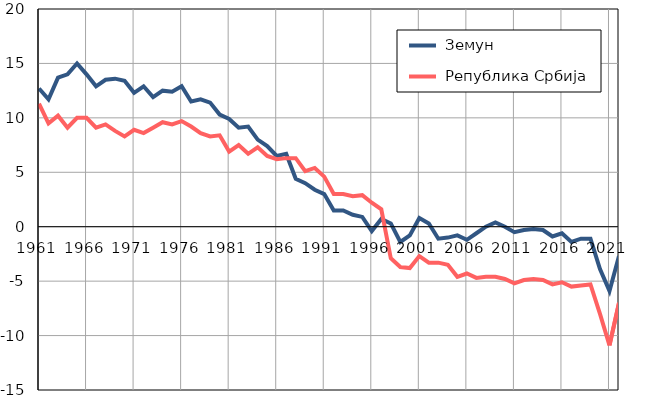
| Category |  Земун |  Република Србија |
|---|---|---|
| 1961.0 | 12.7 | 11.3 |
| 1962.0 | 11.7 | 9.5 |
| 1963.0 | 13.7 | 10.2 |
| 1964.0 | 14 | 9.1 |
| 1965.0 | 15 | 10 |
| 1966.0 | 14 | 10 |
| 1967.0 | 12.9 | 9.1 |
| 1968.0 | 13.5 | 9.4 |
| 1969.0 | 13.6 | 8.8 |
| 1970.0 | 13.4 | 8.3 |
| 1971.0 | 12.3 | 8.9 |
| 1972.0 | 12.9 | 8.6 |
| 1973.0 | 11.9 | 9.1 |
| 1974.0 | 12.5 | 9.6 |
| 1975.0 | 12.4 | 9.4 |
| 1976.0 | 12.9 | 9.7 |
| 1977.0 | 11.5 | 9.2 |
| 1978.0 | 11.7 | 8.6 |
| 1979.0 | 11.4 | 8.3 |
| 1980.0 | 10.3 | 8.4 |
| 1981.0 | 9.9 | 6.9 |
| 1982.0 | 9.1 | 7.5 |
| 1983.0 | 9.2 | 6.7 |
| 1984.0 | 8 | 7.3 |
| 1985.0 | 7.4 | 6.5 |
| 1986.0 | 6.5 | 6.2 |
| 1987.0 | 6.7 | 6.3 |
| 1988.0 | 4.4 | 6.3 |
| 1989.0 | 4 | 5.1 |
| 1990.0 | 3.4 | 5.4 |
| 1991.0 | 3 | 4.6 |
| 1992.0 | 1.5 | 3 |
| 1993.0 | 1.5 | 3 |
| 1994.0 | 1.1 | 2.8 |
| 1995.0 | 0.9 | 2.9 |
| 1996.0 | -0.4 | 2.2 |
| 1997.0 | 0.7 | 1.6 |
| 1998.0 | 0.3 | -2.9 |
| 1999.0 | -1.4 | -3.7 |
| 2000.0 | -0.8 | -3.8 |
| 2001.0 | 0.8 | -2.7 |
| 2002.0 | 0.3 | -3.3 |
| 2003.0 | -1.1 | -3.3 |
| 2004.0 | -1 | -3.5 |
| 2005.0 | -0.8 | -4.6 |
| 2006.0 | -1.2 | -4.3 |
| 2007.0 | -0.6 | -4.7 |
| 2008.0 | 0 | -4.6 |
| 2009.0 | 0.4 | -4.6 |
| 2010.0 | 0 | -4.8 |
| 2011.0 | -0.5 | -5.2 |
| 2012.0 | -0.3 | -4.9 |
| 2013.0 | -0.2 | -4.8 |
| 2014.0 | -0.3 | -4.9 |
| 2015.0 | -0.9 | -5.3 |
| 2016.0 | -0.6 | -5.1 |
| 2017.0 | -1.4 | -5.5 |
| 2018.0 | -1.1 | -5.4 |
| 2019.0 | -1.1 | -5.3 |
| 2020.0 | -3.9 | -8 |
| 2021.0 | -5.9 | -10.9 |
| 2022.0 | -2.7 | -7 |